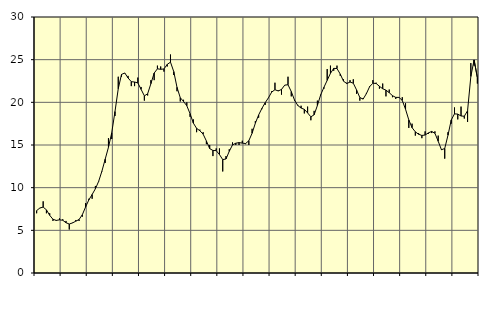
| Category | Piggar | Series 1 |
|---|---|---|
| nan | 7 | 7.31 |
| 87.0 | 7.6 | 7.62 |
| 87.0 | 8.4 | 7.72 |
| 87.0 | 7 | 7.4 |
| nan | 7 | 6.76 |
| 88.0 | 6.1 | 6.3 |
| 88.0 | 6.1 | 6.16 |
| 88.0 | 6.4 | 6.23 |
| nan | 6.3 | 6.18 |
| 89.0 | 6.1 | 5.89 |
| 89.0 | 5.1 | 5.74 |
| 89.0 | 5.9 | 5.87 |
| nan | 6.2 | 6.07 |
| 90.0 | 6.1 | 6.27 |
| 90.0 | 6.6 | 6.83 |
| 90.0 | 8.2 | 7.74 |
| nan | 8.7 | 8.57 |
| 91.0 | 8.7 | 9.2 |
| 91.0 | 10.2 | 9.87 |
| 91.0 | 10.7 | 10.74 |
| nan | 11.9 | 11.94 |
| 92.0 | 12.9 | 13.34 |
| 92.0 | 15.8 | 14.73 |
| 92.0 | 15.7 | 16.43 |
| nan | 18.4 | 18.92 |
| 93.0 | 23 | 21.6 |
| 93.0 | 23 | 23.27 |
| 93.0 | 23.4 | 23.44 |
| nan | 23.1 | 22.86 |
| 94.0 | 21.9 | 22.42 |
| 94.0 | 21.9 | 22.38 |
| 94.0 | 22.9 | 22.28 |
| nan | 21.8 | 21.52 |
| 95.0 | 20.2 | 20.76 |
| 95.0 | 20.8 | 21 |
| 95.0 | 22.6 | 22.19 |
| nan | 22.6 | 23.43 |
| 96.0 | 24.3 | 23.93 |
| 96.0 | 24.2 | 23.87 |
| 96.0 | 23.6 | 23.91 |
| nan | 24.2 | 24.45 |
| 97.0 | 25.6 | 24.71 |
| 97.0 | 23.2 | 23.6 |
| 97.0 | 21.3 | 21.76 |
| nan | 20.1 | 20.54 |
| 98.0 | 20.3 | 20.1 |
| 98.0 | 20 | 19.6 |
| 98.0 | 18.3 | 18.67 |
| nan | 18 | 17.57 |
| 99.0 | 16.5 | 16.95 |
| 99.0 | 16.8 | 16.67 |
| 99.0 | 16.5 | 16.27 |
| nan | 15.1 | 15.47 |
| 0.0 | 15 | 14.58 |
| 0.0 | 13.7 | 14.36 |
| 0.0 | 14.6 | 14.34 |
| nan | 14.6 | 13.88 |
| 1.0 | 11.9 | 13.29 |
| 1.0 | 13.7 | 13.36 |
| 1.0 | 14.5 | 14.26 |
| nan | 15.3 | 15.01 |
| 2.0 | 15 | 15.21 |
| 2.0 | 15 | 15.28 |
| 2.0 | 15.5 | 15.22 |
| nan | 15.1 | 15.17 |
| 3.0 | 15 | 15.5 |
| 3.0 | 16.9 | 16.38 |
| 3.0 | 17.8 | 17.56 |
| nan | 18.2 | 18.52 |
| 4.0 | 19.2 | 19.29 |
| 4.0 | 19.7 | 19.95 |
| 4.0 | 20.5 | 20.53 |
| nan | 21.3 | 21.2 |
| 5.0 | 22.3 | 21.48 |
| 5.0 | 21.4 | 21.33 |
| 5.0 | 20.9 | 21.51 |
| nan | 22 | 22.02 |
| 6.0 | 23 | 22.06 |
| 6.0 | 20.7 | 21.26 |
| 6.0 | 20.2 | 20.26 |
| nan | 19.7 | 19.63 |
| 7.0 | 19.6 | 19.33 |
| 7.0 | 18.7 | 19.18 |
| 7.0 | 19.5 | 18.76 |
| nan | 17.9 | 18.3 |
| 8.0 | 19 | 18.54 |
| 8.0 | 20.2 | 19.63 |
| 8.0 | 20.9 | 20.87 |
| nan | 21.6 | 21.76 |
| 9.0 | 23.9 | 22.58 |
| 9.0 | 24.3 | 23.4 |
| 9.0 | 23.7 | 23.98 |
| nan | 24.3 | 23.96 |
| 10.0 | 23.1 | 23.31 |
| 10.0 | 22.7 | 22.48 |
| 10.0 | 22.3 | 22.2 |
| nan | 22.6 | 22.38 |
| 11.0 | 22.7 | 22.24 |
| 11.0 | 21 | 21.45 |
| 11.0 | 20.2 | 20.56 |
| nan | 20.5 | 20.38 |
| 12.0 | 21.1 | 21.01 |
| 12.0 | 21.9 | 21.84 |
| 12.0 | 22.6 | 22.24 |
| nan | 22.3 | 22.21 |
| 13.0 | 21.6 | 21.88 |
| 13.0 | 22.2 | 21.59 |
| 13.0 | 20.7 | 21.43 |
| nan | 21.5 | 21.13 |
| 14.0 | 20.6 | 20.78 |
| 14.0 | 20.4 | 20.58 |
| 14.0 | 20.6 | 20.58 |
| nan | 20.6 | 20.22 |
| 15.0 | 19.9 | 19.19 |
| 15.0 | 17 | 17.94 |
| 15.0 | 17.5 | 17.03 |
| nan | 16.1 | 16.54 |
| 16.0 | 16.4 | 16.26 |
| 16.0 | 15.8 | 16.12 |
| 16.0 | 16.6 | 16.17 |
| nan | 16.3 | 16.42 |
| 17.0 | 16.4 | 16.59 |
| 17.0 | 16.6 | 16.37 |
| 17.0 | 16.1 | 15.44 |
| nan | 14.5 | 14.44 |
| 18.0 | 13.4 | 14.59 |
| 18.0 | 16.5 | 16.15 |
| 18.0 | 17.5 | 17.94 |
| nan | 19.4 | 18.65 |
| 19.0 | 18 | 18.62 |
| 19.0 | 19.5 | 18.4 |
| 19.0 | 18.1 | 18.37 |
| nan | 17.7 | 19.02 |
| 20.0 | 24.6 | 23.03 |
| 20.0 | 24.3 | 24.97 |
| 20.0 | 22.2 | 22.89 |